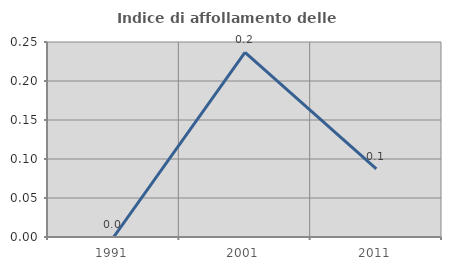
| Category | Indice di affollamento delle abitazioni  |
|---|---|
| 1991.0 | 0 |
| 2001.0 | 0.237 |
| 2011.0 | 0.087 |